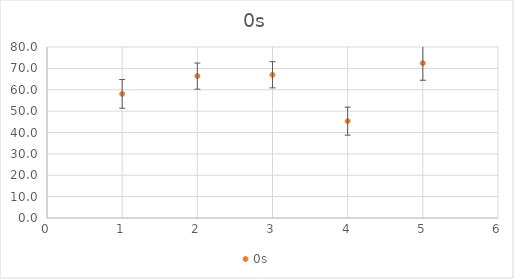
| Category | 0s |
|---|---|
| 0 | 58.062 |
| 1 | 66.375 |
| 2 | 67 |
| 3 | 45.312 |
| 4 | 72.438 |